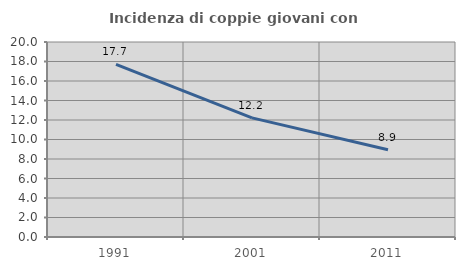
| Category | Incidenza di coppie giovani con figli |
|---|---|
| 1991.0 | 17.707 |
| 2001.0 | 12.216 |
| 2011.0 | 8.95 |